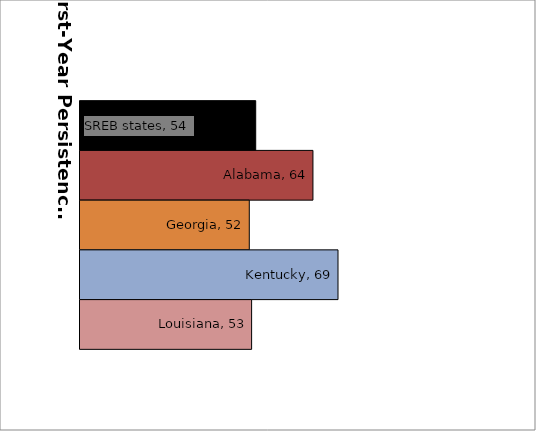
| Category | SREB states | Alabama | Georgia | Kentucky | Louisiana |
|---|---|---|---|---|---|
| 0 | 53.548 | 64.477 | 52.321 | 69.261 | 52.766 |